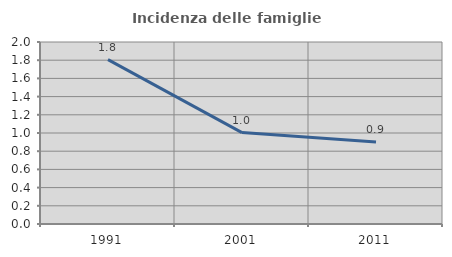
| Category | Incidenza delle famiglie numerose |
|---|---|
| 1991.0 | 1.806 |
| 2001.0 | 1.005 |
| 2011.0 | 0.9 |